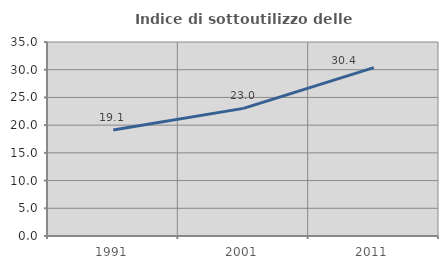
| Category | Indice di sottoutilizzo delle abitazioni  |
|---|---|
| 1991.0 | 19.113 |
| 2001.0 | 23.022 |
| 2011.0 | 30.379 |